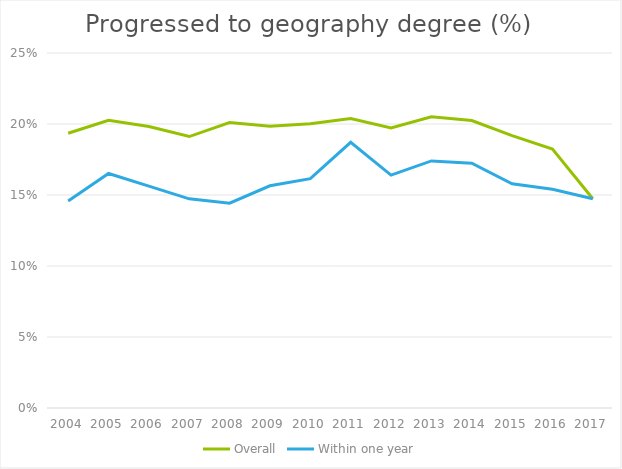
| Category | Overall | Within one year |
|---|---|---|
| 2004.0 | 0.193 | 0.146 |
| 2005.0 | 0.203 | 0.165 |
| 2006.0 | 0.198 | 0.156 |
| 2007.0 | 0.191 | 0.147 |
| 2008.0 | 0.201 | 0.144 |
| 2009.0 | 0.198 | 0.157 |
| 2010.0 | 0.2 | 0.161 |
| 2011.0 | 0.204 | 0.187 |
| 2012.0 | 0.197 | 0.164 |
| 2013.0 | 0.205 | 0.174 |
| 2014.0 | 0.202 | 0.172 |
| 2015.0 | 0.192 | 0.158 |
| 2016.0 | 0.182 | 0.154 |
| 2017.0 | 0.147 | 0.147 |